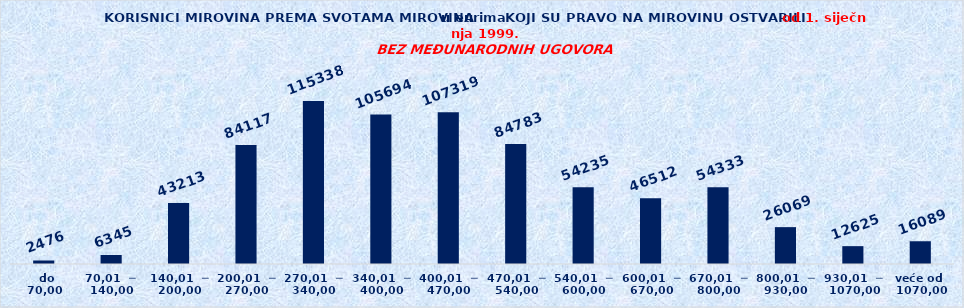
| Category | Series 0 |
|---|---|
|   do  70,00 | 2476 |
| 70,01  ─  140,00 | 6345 |
| 140,01  ─  200,00 | 43213 |
| 200,01  ─  270,00 | 84117 |
| 270,01  ─  340,00 | 115338 |
| 340,01  ─  400,00 | 105694 |
| 400,01  ─  470,00 | 107319 |
| 470,01  ─  540,00 | 84783 |
| 540,01  ─  600,00 | 54235 |
| 600,01  ─  670,00 | 46512 |
| 670,01  ─  800,00 | 54333 |
| 800,01  ─  930,00 | 26069 |
| 930,01  ─  1070,00 | 12625 |
| veće od  1070,00 | 16089 |